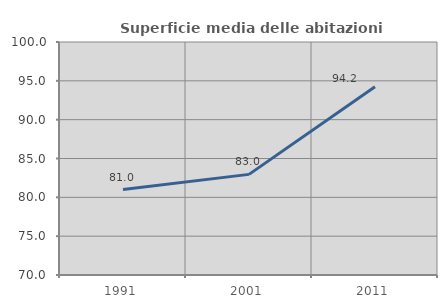
| Category | Superficie media delle abitazioni occupate |
|---|---|
| 1991.0 | 81 |
| 2001.0 | 82.956 |
| 2011.0 | 94.242 |